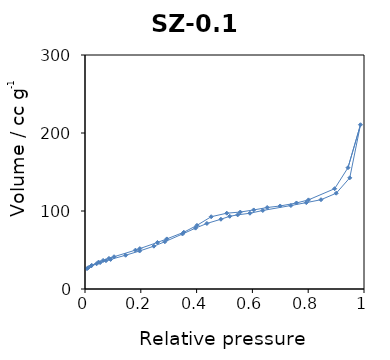
| Category | Series 0 |
|---|---|
| 0.007329 | 26.068 |
| 0.011897 | 27.426 |
| 0.021924 | 29.545 |
| 0.04154 | 32.317 |
| 0.054237 | 33.826 |
| 0.075192 | 36.264 |
| 0.09178 | 37.937 |
| 0.145601 | 43.271 |
| 0.195681 | 48.738 |
| 0.24691 | 54.921 |
| 0.286312 | 60.608 |
| 0.349415 | 70.549 |
| 0.396258 | 78.032 |
| 0.436983 | 84.035 |
| 0.487209 | 89.434 |
| 0.51877 | 93.224 |
| 0.547225 | 95.046 |
| 0.591133 | 97.12 |
| 0.637165 | 100.652 |
| 0.73807 | 107.029 |
| 0.793183 | 110.721 |
| 0.845859 | 114.479 |
| 0.900504 | 122.803 |
| 0.948947 | 142.513 |
| 0.987436 | 210.578 |
| 0.94261 | 155.516 |
| 0.894844 | 128.612 |
| 0.800914 | 114.26 |
| 0.758005 | 110.284 |
| 0.699537 | 106.448 |
| 0.653062 | 104.484 |
| 0.604639 | 101.359 |
| 0.556483 | 98.639 |
| 0.508122 | 97.194 |
| 0.452329 | 92.663 |
| 0.401163 | 81.577 |
| 0.354157 | 72.754 |
| 0.293202 | 64.22 |
| 0.259651 | 59.669 |
| 0.196494 | 51.801 |
| 0.180732 | 49.832 |
| 0.104038 | 41.376 |
| 0.085805 | 39.206 |
| 0.06497 | 36.648 |
| 0.048265 | 34.402 |
| 0.024142 | 30.358 |